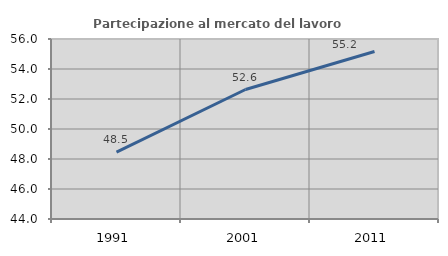
| Category | Partecipazione al mercato del lavoro  femminile |
|---|---|
| 1991.0 | 48.455 |
| 2001.0 | 52.633 |
| 2011.0 | 55.166 |